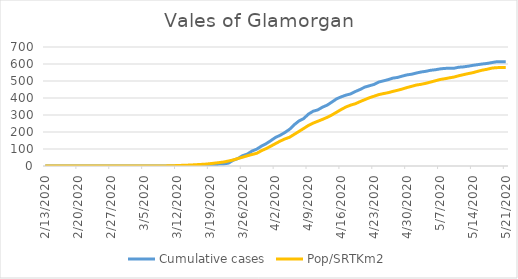
| Category | Cumulative cases | Pop/SRTKm2 |
|---|---|---|
| 5/21/20 | 613 | 578.768 |
| 5/20/20 | 613 | 578.768 |
| 5/19/20 | 613 | 578.632 |
| 5/18/20 | 608 | 575.46 |
| 5/17/20 | 603 | 568.707 |
| 5/16/20 | 600 | 563.677 |
| 5/15/20 | 596 | 556.607 |
| 5/14/20 | 592 | 548.767 |
| 5/13/20 | 587 | 543.329 |
| 5/12/20 | 583 | 537.075 |
| 5/11/20 | 581 | 530.866 |
| 5/10/20 | 575 | 523.162 |
| 5/9/20 | 575 | 518.675 |
| 5/8/20 | 574 | 513.056 |
| 5/7/20 | 571 | 508.524 |
| 5/6/20 | 566 | 501.046 |
| 5/5/20 | 563 | 493.568 |
| 5/4/20 | 557 | 486.363 |
| 5/3/20 | 553 | 480.562 |
| 5/2/20 | 547 | 476.302 |
| 5/1/20 | 540 | 468.734 |
| 4/30/20 | 536 | 461.573 |
| 4/29/20 | 529 | 452.872 |
| 4/28/20 | 521 | 445.485 |
| 4/27/20 | 517 | 438.869 |
| 4/26/20 | 508 | 431.436 |
| 4/25/20 | 501 | 426.043 |
| 4/24/20 | 494 | 419.925 |
| 4/23/20 | 480 | 410.544 |
| 4/22/20 | 472 | 401.571 |
| 4/21/20 | 464 | 390.196 |
| 4/20/20 | 450 | 378.73 |
| 4/19/20 | 438 | 366.268 |
| 4/18/20 | 424 | 358.201 |
| 4/17/20 | 417 | 347.188 |
| 4/16/20 | 407 | 332.596 |
| 4/15/20 | 395 | 316.326 |
| 4/14/20 | 376 | 300.238 |
| 4/13/20 | 358 | 286.189 |
| 4/12/20 | 346 | 274.089 |
| 4/11/20 | 330 | 263.076 |
| 4/10/20 | 322 | 252.019 |
| 4/9/20 | 305 | 238.423 |
| 4/8/20 | 279 | 220.749 |
| 4/7/20 | 265 | 203.391 |
| 4/6/20 | 243 | 186.351 |
| 4/5/20 | 216 | 169.176 |
| 4/4/20 | 197 | 159.16 |
| 4/3/20 | 181 | 146.425 |
| 4/2/20 | 168 | 131.742 |
| 4/1/20 | 149 | 116.651 |
| 3/31/20 | 131 | 102.149 |
| 3/30/20 | 117 | 89.867 |
| 3/29/20 | 99 | 74.731 |
| 3/28/20 | 88 | 67.661 |
| 3/27/20 | 70 | 60.138 |
| 3/26/20 | 61 | 51.754 |
| 3/25/20 | 44 | 43.869 |
| 3/24/20 | 34 | 35.575 |
| 3/23/20 | 17 | 29.457 |
| 3/22/20 | 12 | 23.566 |
| 3/21/20 | 11 | 20.122 |
| 3/20/20 | 6 | 16.723 |
| 3/19/20 | 5 | 13.46 |
| 3/18/20 | 3 | 10.741 |
| 3/17/20 | 1 | 9.154 |
| 3/16/20 | 1 | 7.478 |
| 3/15/20 | 1 | 5.937 |
| 3/14/20 | 1 | 4.623 |
| 3/13/20 | 0 | 3.761 |
| 3/12/20 | 0 | 2.538 |
| 3/11/20 | 0 | 1.45 |
| 3/10/20 | 0 | 0.816 |
| 3/9/20 | 0 | 0.317 |
| 3/8/20 | 0 | 0.181 |
| 3/7/20 | 0 | 0.181 |
| 3/6/20 | 0 | 0.091 |
| 3/5/20 | 0 | 0.091 |
| 3/4/20 | 0 | 0.091 |
| 3/3/20 | 0 | 0.045 |
| 3/2/20 | 0 | 0.045 |
| 3/1/20 | 0 | 0.045 |
| 2/29/20 | 0 | 0.045 |
| 2/28/20 | 0 | 0.045 |
| 2/27/20 | 0 | 0.045 |
| 2/26/20 | 0 | 0 |
| 2/25/20 | 0 | 0 |
| 2/24/20 | 0 | 0 |
| 2/23/20 | 0 | 0 |
| 2/22/20 | 0 | 0 |
| 2/21/20 | 0 | 0 |
| 2/20/20 | 0 | 0 |
| 2/19/20 | 0 | 0 |
| 2/18/20 | 0 | 0 |
| 2/17/20 | 0 | 0 |
| 2/16/20 | 0 | 0 |
| 2/15/20 | 0 | 0 |
| 2/14/20 | 0 | 0 |
| 2/13/20 | 0 | 0 |